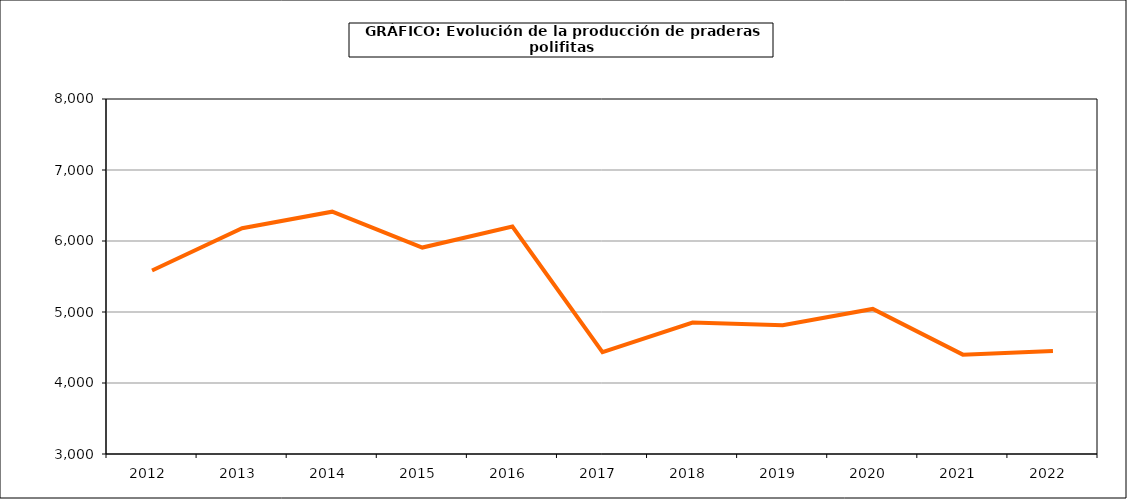
| Category | Producción |
|---|---|
| 2012.0 | 5584.28 |
| 2013.0 | 6180.164 |
| 2014.0 | 6413.135 |
| 2015.0 | 5907.876 |
| 2016.0 | 6204.083 |
| 2017.0 | 4432.964 |
| 2018.0 | 4851.915 |
| 2019.0 | 4814.376 |
| 2020.0 | 5043.524 |
| 2021.0 | 4399.197 |
| 2022.0 | 4450.032 |